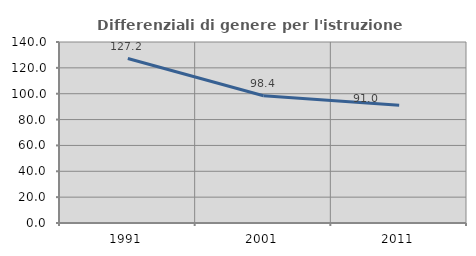
| Category | Differenziali di genere per l'istruzione superiore |
|---|---|
| 1991.0 | 127.184 |
| 2001.0 | 98.387 |
| 2011.0 | 90.986 |